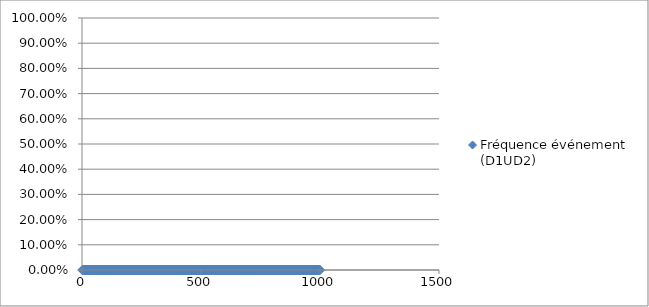
| Category | Fréquence événement (D1UD2) |
|---|---|
| 1.0 | 0 |
| 2.0 | 0 |
| 3.0 | 0 |
| 4.0 | 0 |
| 5.0 | 0 |
| 6.0 | 0 |
| 7.0 | 0 |
| 8.0 | 0 |
| 9.0 | 0 |
| 10.0 | 0 |
| 11.0 | 0 |
| 12.0 | 0 |
| 13.0 | 0 |
| 14.0 | 0 |
| 15.0 | 0 |
| 16.0 | 0 |
| 17.0 | 0 |
| 18.0 | 0 |
| 19.0 | 0 |
| 20.0 | 0 |
| 21.0 | 0 |
| 22.0 | 0 |
| 23.0 | 0 |
| 24.0 | 0 |
| 25.0 | 0 |
| 26.0 | 0 |
| 27.0 | 0 |
| 28.0 | 0 |
| 29.0 | 0 |
| 30.0 | 0 |
| 31.0 | 0 |
| 32.0 | 0 |
| 33.0 | 0 |
| 34.0 | 0 |
| 35.0 | 0 |
| 36.0 | 0 |
| 37.0 | 0 |
| 38.0 | 0 |
| 39.0 | 0 |
| 40.0 | 0 |
| 41.0 | 0 |
| 42.0 | 0 |
| 43.0 | 0 |
| 44.0 | 0 |
| 45.0 | 0 |
| 46.0 | 0 |
| 47.0 | 0 |
| 48.0 | 0 |
| 49.0 | 0 |
| 50.0 | 0 |
| 51.0 | 0 |
| 52.0 | 0 |
| 53.0 | 0 |
| 54.0 | 0 |
| 55.0 | 0 |
| 56.0 | 0 |
| 57.0 | 0 |
| 58.0 | 0 |
| 59.0 | 0 |
| 60.0 | 0 |
| 61.0 | 0 |
| 62.0 | 0 |
| 63.0 | 0 |
| 64.0 | 0 |
| 65.0 | 0 |
| 66.0 | 0 |
| 67.0 | 0 |
| 68.0 | 0 |
| 69.0 | 0 |
| 70.0 | 0 |
| 71.0 | 0 |
| 72.0 | 0 |
| 73.0 | 0 |
| 74.0 | 0 |
| 75.0 | 0 |
| 76.0 | 0 |
| 77.0 | 0 |
| 78.0 | 0 |
| 79.0 | 0 |
| 80.0 | 0 |
| 81.0 | 0 |
| 82.0 | 0 |
| 83.0 | 0 |
| 84.0 | 0 |
| 85.0 | 0 |
| 86.0 | 0 |
| 87.0 | 0 |
| 88.0 | 0 |
| 89.0 | 0 |
| 90.0 | 0 |
| 91.0 | 0 |
| 92.0 | 0 |
| 93.0 | 0 |
| 94.0 | 0 |
| 95.0 | 0 |
| 96.0 | 0 |
| 97.0 | 0 |
| 98.0 | 0 |
| 99.0 | 0 |
| 100.0 | 0 |
| 101.0 | 0 |
| 102.0 | 0 |
| 103.0 | 0 |
| 104.0 | 0 |
| 105.0 | 0 |
| 106.0 | 0 |
| 107.0 | 0 |
| 108.0 | 0 |
| 109.0 | 0 |
| 110.0 | 0 |
| 111.0 | 0 |
| 112.0 | 0 |
| 113.0 | 0 |
| 114.0 | 0 |
| 115.0 | 0 |
| 116.0 | 0 |
| 117.0 | 0 |
| 118.0 | 0 |
| 119.0 | 0 |
| 120.0 | 0 |
| 121.0 | 0 |
| 122.0 | 0 |
| 123.0 | 0 |
| 124.0 | 0 |
| 125.0 | 0 |
| 126.0 | 0 |
| 127.0 | 0 |
| 128.0 | 0 |
| 129.0 | 0 |
| 130.0 | 0 |
| 131.0 | 0 |
| 132.0 | 0 |
| 133.0 | 0 |
| 134.0 | 0 |
| 135.0 | 0 |
| 136.0 | 0 |
| 137.0 | 0 |
| 138.0 | 0 |
| 139.0 | 0 |
| 140.0 | 0 |
| 141.0 | 0 |
| 142.0 | 0 |
| 143.0 | 0 |
| 144.0 | 0 |
| 145.0 | 0 |
| 146.0 | 0 |
| 147.0 | 0 |
| 148.0 | 0 |
| 149.0 | 0 |
| 150.0 | 0 |
| 151.0 | 0 |
| 152.0 | 0 |
| 153.0 | 0 |
| 154.0 | 0 |
| 155.0 | 0 |
| 156.0 | 0 |
| 157.0 | 0 |
| 158.0 | 0 |
| 159.0 | 0 |
| 160.0 | 0 |
| 161.0 | 0 |
| 162.0 | 0 |
| 163.0 | 0 |
| 164.0 | 0 |
| 165.0 | 0 |
| 166.0 | 0 |
| 167.0 | 0 |
| 168.0 | 0 |
| 169.0 | 0 |
| 170.0 | 0 |
| 171.0 | 0 |
| 172.0 | 0 |
| 173.0 | 0 |
| 174.0 | 0 |
| 175.0 | 0 |
| 176.0 | 0 |
| 177.0 | 0 |
| 178.0 | 0 |
| 179.0 | 0 |
| 180.0 | 0 |
| 181.0 | 0 |
| 182.0 | 0 |
| 183.0 | 0 |
| 184.0 | 0 |
| 185.0 | 0 |
| 186.0 | 0 |
| 187.0 | 0 |
| 188.0 | 0 |
| 189.0 | 0 |
| 190.0 | 0 |
| 191.0 | 0 |
| 192.0 | 0 |
| 193.0 | 0 |
| 194.0 | 0 |
| 195.0 | 0 |
| 196.0 | 0 |
| 197.0 | 0 |
| 198.0 | 0 |
| 199.0 | 0 |
| 200.0 | 0 |
| 201.0 | 0 |
| 202.0 | 0 |
| 203.0 | 0 |
| 204.0 | 0 |
| 205.0 | 0 |
| 206.0 | 0 |
| 207.0 | 0 |
| 208.0 | 0 |
| 209.0 | 0 |
| 210.0 | 0 |
| 211.0 | 0 |
| 212.0 | 0 |
| 213.0 | 0 |
| 214.0 | 0 |
| 215.0 | 0 |
| 216.0 | 0 |
| 217.0 | 0 |
| 218.0 | 0 |
| 219.0 | 0 |
| 220.0 | 0 |
| 221.0 | 0 |
| 222.0 | 0 |
| 223.0 | 0 |
| 224.0 | 0 |
| 225.0 | 0 |
| 226.0 | 0 |
| 227.0 | 0 |
| 228.0 | 0 |
| 229.0 | 0 |
| 230.0 | 0 |
| 231.0 | 0 |
| 232.0 | 0 |
| 233.0 | 0 |
| 234.0 | 0 |
| 235.0 | 0 |
| 236.0 | 0 |
| 237.0 | 0 |
| 238.0 | 0 |
| 239.0 | 0 |
| 240.0 | 0 |
| 241.0 | 0 |
| 242.0 | 0 |
| 243.0 | 0 |
| 244.0 | 0 |
| 245.0 | 0 |
| 246.0 | 0 |
| 247.0 | 0 |
| 248.0 | 0 |
| 249.0 | 0 |
| 250.0 | 0 |
| 251.0 | 0 |
| 252.0 | 0 |
| 253.0 | 0 |
| 254.0 | 0 |
| 255.0 | 0 |
| 256.0 | 0 |
| 257.0 | 0 |
| 258.0 | 0 |
| 259.0 | 0 |
| 260.0 | 0 |
| 261.0 | 0 |
| 262.0 | 0 |
| 263.0 | 0 |
| 264.0 | 0 |
| 265.0 | 0 |
| 266.0 | 0 |
| 267.0 | 0 |
| 268.0 | 0 |
| 269.0 | 0 |
| 270.0 | 0 |
| 271.0 | 0 |
| 272.0 | 0 |
| 273.0 | 0 |
| 274.0 | 0 |
| 275.0 | 0 |
| 276.0 | 0 |
| 277.0 | 0 |
| 278.0 | 0 |
| 279.0 | 0 |
| 280.0 | 0 |
| 281.0 | 0 |
| 282.0 | 0 |
| 283.0 | 0 |
| 284.0 | 0 |
| 285.0 | 0 |
| 286.0 | 0 |
| 287.0 | 0 |
| 288.0 | 0 |
| 289.0 | 0 |
| 290.0 | 0 |
| 291.0 | 0 |
| 292.0 | 0 |
| 293.0 | 0 |
| 294.0 | 0 |
| 295.0 | 0 |
| 296.0 | 0 |
| 297.0 | 0 |
| 298.0 | 0 |
| 299.0 | 0 |
| 300.0 | 0 |
| 301.0 | 0 |
| 302.0 | 0 |
| 303.0 | 0 |
| 304.0 | 0 |
| 305.0 | 0 |
| 306.0 | 0 |
| 307.0 | 0 |
| 308.0 | 0 |
| 309.0 | 0 |
| 310.0 | 0 |
| 311.0 | 0 |
| 312.0 | 0 |
| 313.0 | 0 |
| 314.0 | 0 |
| 315.0 | 0 |
| 316.0 | 0 |
| 317.0 | 0 |
| 318.0 | 0 |
| 319.0 | 0 |
| 320.0 | 0 |
| 321.0 | 0 |
| 322.0 | 0 |
| 323.0 | 0 |
| 324.0 | 0 |
| 325.0 | 0 |
| 326.0 | 0 |
| 327.0 | 0 |
| 328.0 | 0 |
| 329.0 | 0 |
| 330.0 | 0 |
| 331.0 | 0 |
| 332.0 | 0 |
| 333.0 | 0 |
| 334.0 | 0 |
| 335.0 | 0 |
| 336.0 | 0 |
| 337.0 | 0 |
| 338.0 | 0 |
| 339.0 | 0 |
| 340.0 | 0 |
| 341.0 | 0 |
| 342.0 | 0 |
| 343.0 | 0 |
| 344.0 | 0 |
| 345.0 | 0 |
| 346.0 | 0 |
| 347.0 | 0 |
| 348.0 | 0 |
| 349.0 | 0 |
| 350.0 | 0 |
| 351.0 | 0 |
| 352.0 | 0 |
| 353.0 | 0 |
| 354.0 | 0 |
| 355.0 | 0 |
| 356.0 | 0 |
| 357.0 | 0 |
| 358.0 | 0 |
| 359.0 | 0 |
| 360.0 | 0 |
| 361.0 | 0 |
| 362.0 | 0 |
| 363.0 | 0 |
| 364.0 | 0 |
| 365.0 | 0 |
| 366.0 | 0 |
| 367.0 | 0 |
| 368.0 | 0 |
| 369.0 | 0 |
| 370.0 | 0 |
| 371.0 | 0 |
| 372.0 | 0 |
| 373.0 | 0 |
| 374.0 | 0 |
| 375.0 | 0 |
| 376.0 | 0 |
| 377.0 | 0 |
| 378.0 | 0 |
| 379.0 | 0 |
| 380.0 | 0 |
| 381.0 | 0 |
| 382.0 | 0 |
| 383.0 | 0 |
| 384.0 | 0 |
| 385.0 | 0 |
| 386.0 | 0 |
| 387.0 | 0 |
| 388.0 | 0 |
| 389.0 | 0 |
| 390.0 | 0 |
| 391.0 | 0 |
| 392.0 | 0 |
| 393.0 | 0 |
| 394.0 | 0 |
| 395.0 | 0 |
| 396.0 | 0 |
| 397.0 | 0 |
| 398.0 | 0 |
| 399.0 | 0 |
| 400.0 | 0 |
| 401.0 | 0 |
| 402.0 | 0 |
| 403.0 | 0 |
| 404.0 | 0 |
| 405.0 | 0 |
| 406.0 | 0 |
| 407.0 | 0 |
| 408.0 | 0 |
| 409.0 | 0 |
| 410.0 | 0 |
| 411.0 | 0 |
| 412.0 | 0 |
| 413.0 | 0 |
| 414.0 | 0 |
| 415.0 | 0 |
| 416.0 | 0 |
| 417.0 | 0 |
| 418.0 | 0 |
| 419.0 | 0 |
| 420.0 | 0 |
| 421.0 | 0 |
| 422.0 | 0 |
| 423.0 | 0 |
| 424.0 | 0 |
| 425.0 | 0 |
| 426.0 | 0 |
| 427.0 | 0 |
| 428.0 | 0 |
| 429.0 | 0 |
| 430.0 | 0 |
| 431.0 | 0 |
| 432.0 | 0 |
| 433.0 | 0 |
| 434.0 | 0 |
| 435.0 | 0 |
| 436.0 | 0 |
| 437.0 | 0 |
| 438.0 | 0 |
| 439.0 | 0 |
| 440.0 | 0 |
| 441.0 | 0 |
| 442.0 | 0 |
| 443.0 | 0 |
| 444.0 | 0 |
| 445.0 | 0 |
| 446.0 | 0 |
| 447.0 | 0 |
| 448.0 | 0 |
| 449.0 | 0 |
| 450.0 | 0 |
| 451.0 | 0 |
| 452.0 | 0 |
| 453.0 | 0 |
| 454.0 | 0 |
| 455.0 | 0 |
| 456.0 | 0 |
| 457.0 | 0 |
| 458.0 | 0 |
| 459.0 | 0 |
| 460.0 | 0 |
| 461.0 | 0 |
| 462.0 | 0 |
| 463.0 | 0 |
| 464.0 | 0 |
| 465.0 | 0 |
| 466.0 | 0 |
| 467.0 | 0 |
| 468.0 | 0 |
| 469.0 | 0 |
| 470.0 | 0 |
| 471.0 | 0 |
| 472.0 | 0 |
| 473.0 | 0 |
| 474.0 | 0 |
| 475.0 | 0 |
| 476.0 | 0 |
| 477.0 | 0 |
| 478.0 | 0 |
| 479.0 | 0 |
| 480.0 | 0 |
| 481.0 | 0 |
| 482.0 | 0 |
| 483.0 | 0 |
| 484.0 | 0 |
| 485.0 | 0 |
| 486.0 | 0 |
| 487.0 | 0 |
| 488.0 | 0 |
| 489.0 | 0 |
| 490.0 | 0 |
| 491.0 | 0 |
| 492.0 | 0 |
| 493.0 | 0 |
| 494.0 | 0 |
| 495.0 | 0 |
| 496.0 | 0 |
| 497.0 | 0 |
| 498.0 | 0 |
| 499.0 | 0 |
| 500.0 | 0 |
| 501.0 | 0 |
| 502.0 | 0 |
| 503.0 | 0 |
| 504.0 | 0 |
| 505.0 | 0 |
| 506.0 | 0 |
| 507.0 | 0 |
| 508.0 | 0 |
| 509.0 | 0 |
| 510.0 | 0 |
| 511.0 | 0 |
| 512.0 | 0 |
| 513.0 | 0 |
| 514.0 | 0 |
| 515.0 | 0 |
| 516.0 | 0 |
| 517.0 | 0 |
| 518.0 | 0 |
| 519.0 | 0 |
| 520.0 | 0 |
| 521.0 | 0 |
| 522.0 | 0 |
| 523.0 | 0 |
| 524.0 | 0 |
| 525.0 | 0 |
| 526.0 | 0 |
| 527.0 | 0 |
| 528.0 | 0 |
| 529.0 | 0 |
| 530.0 | 0 |
| 531.0 | 0 |
| 532.0 | 0 |
| 533.0 | 0 |
| 534.0 | 0 |
| 535.0 | 0 |
| 536.0 | 0 |
| 537.0 | 0 |
| 538.0 | 0 |
| 539.0 | 0 |
| 540.0 | 0 |
| 541.0 | 0 |
| 542.0 | 0 |
| 543.0 | 0 |
| 544.0 | 0 |
| 545.0 | 0 |
| 546.0 | 0 |
| 547.0 | 0 |
| 548.0 | 0 |
| 549.0 | 0 |
| 550.0 | 0 |
| 551.0 | 0 |
| 552.0 | 0 |
| 553.0 | 0 |
| 554.0 | 0 |
| 555.0 | 0 |
| 556.0 | 0 |
| 557.0 | 0 |
| 558.0 | 0 |
| 559.0 | 0 |
| 560.0 | 0 |
| 561.0 | 0 |
| 562.0 | 0 |
| 563.0 | 0 |
| 564.0 | 0 |
| 565.0 | 0 |
| 566.0 | 0 |
| 567.0 | 0 |
| 568.0 | 0 |
| 569.0 | 0 |
| 570.0 | 0 |
| 571.0 | 0 |
| 572.0 | 0 |
| 573.0 | 0 |
| 574.0 | 0 |
| 575.0 | 0 |
| 576.0 | 0 |
| 577.0 | 0 |
| 578.0 | 0 |
| 579.0 | 0 |
| 580.0 | 0 |
| 581.0 | 0 |
| 582.0 | 0 |
| 583.0 | 0 |
| 584.0 | 0 |
| 585.0 | 0 |
| 586.0 | 0 |
| 587.0 | 0 |
| 588.0 | 0 |
| 589.0 | 0 |
| 590.0 | 0 |
| 591.0 | 0 |
| 592.0 | 0 |
| 593.0 | 0 |
| 594.0 | 0 |
| 595.0 | 0 |
| 596.0 | 0 |
| 597.0 | 0 |
| 598.0 | 0 |
| 599.0 | 0 |
| 600.0 | 0 |
| 601.0 | 0 |
| 602.0 | 0 |
| 603.0 | 0 |
| 604.0 | 0 |
| 605.0 | 0 |
| 606.0 | 0 |
| 607.0 | 0 |
| 608.0 | 0 |
| 609.0 | 0 |
| 610.0 | 0 |
| 611.0 | 0 |
| 612.0 | 0 |
| 613.0 | 0 |
| 614.0 | 0 |
| 615.0 | 0 |
| 616.0 | 0 |
| 617.0 | 0 |
| 618.0 | 0 |
| 619.0 | 0 |
| 620.0 | 0 |
| 621.0 | 0 |
| 622.0 | 0 |
| 623.0 | 0 |
| 624.0 | 0 |
| 625.0 | 0 |
| 626.0 | 0 |
| 627.0 | 0 |
| 628.0 | 0 |
| 629.0 | 0 |
| 630.0 | 0 |
| 631.0 | 0 |
| 632.0 | 0 |
| 633.0 | 0 |
| 634.0 | 0 |
| 635.0 | 0 |
| 636.0 | 0 |
| 637.0 | 0 |
| 638.0 | 0 |
| 639.0 | 0 |
| 640.0 | 0 |
| 641.0 | 0 |
| 642.0 | 0 |
| 643.0 | 0 |
| 644.0 | 0 |
| 645.0 | 0 |
| 646.0 | 0 |
| 647.0 | 0 |
| 648.0 | 0 |
| 649.0 | 0 |
| 650.0 | 0 |
| 651.0 | 0 |
| 652.0 | 0 |
| 653.0 | 0 |
| 654.0 | 0 |
| 655.0 | 0 |
| 656.0 | 0 |
| 657.0 | 0 |
| 658.0 | 0 |
| 659.0 | 0 |
| 660.0 | 0 |
| 661.0 | 0 |
| 662.0 | 0 |
| 663.0 | 0 |
| 664.0 | 0 |
| 665.0 | 0 |
| 666.0 | 0 |
| 667.0 | 0 |
| 668.0 | 0 |
| 669.0 | 0 |
| 670.0 | 0 |
| 671.0 | 0 |
| 672.0 | 0 |
| 673.0 | 0 |
| 674.0 | 0 |
| 675.0 | 0 |
| 676.0 | 0 |
| 677.0 | 0 |
| 678.0 | 0 |
| 679.0 | 0 |
| 680.0 | 0 |
| 681.0 | 0 |
| 682.0 | 0 |
| 683.0 | 0 |
| 684.0 | 0 |
| 685.0 | 0 |
| 686.0 | 0 |
| 687.0 | 0 |
| 688.0 | 0 |
| 689.0 | 0 |
| 690.0 | 0 |
| 691.0 | 0 |
| 692.0 | 0 |
| 693.0 | 0 |
| 694.0 | 0 |
| 695.0 | 0 |
| 696.0 | 0 |
| 697.0 | 0 |
| 698.0 | 0 |
| 699.0 | 0 |
| 700.0 | 0 |
| 701.0 | 0 |
| 702.0 | 0 |
| 703.0 | 0 |
| 704.0 | 0 |
| 705.0 | 0 |
| 706.0 | 0 |
| 707.0 | 0 |
| 708.0 | 0 |
| 709.0 | 0 |
| 710.0 | 0 |
| 711.0 | 0 |
| 712.0 | 0 |
| 713.0 | 0 |
| 714.0 | 0 |
| 715.0 | 0 |
| 716.0 | 0 |
| 717.0 | 0 |
| 718.0 | 0 |
| 719.0 | 0 |
| 720.0 | 0 |
| 721.0 | 0 |
| 722.0 | 0 |
| 723.0 | 0 |
| 724.0 | 0 |
| 725.0 | 0 |
| 726.0 | 0 |
| 727.0 | 0 |
| 728.0 | 0 |
| 729.0 | 0 |
| 730.0 | 0 |
| 731.0 | 0 |
| 732.0 | 0 |
| 733.0 | 0 |
| 734.0 | 0 |
| 735.0 | 0 |
| 736.0 | 0 |
| 737.0 | 0 |
| 738.0 | 0 |
| 739.0 | 0 |
| 740.0 | 0 |
| 741.0 | 0 |
| 742.0 | 0 |
| 743.0 | 0 |
| 744.0 | 0 |
| 745.0 | 0 |
| 746.0 | 0 |
| 747.0 | 0 |
| 748.0 | 0 |
| 749.0 | 0 |
| 750.0 | 0 |
| 751.0 | 0 |
| 752.0 | 0 |
| 753.0 | 0 |
| 754.0 | 0 |
| 755.0 | 0 |
| 756.0 | 0 |
| 757.0 | 0 |
| 758.0 | 0 |
| 759.0 | 0 |
| 760.0 | 0 |
| 761.0 | 0 |
| 762.0 | 0 |
| 763.0 | 0 |
| 764.0 | 0 |
| 765.0 | 0 |
| 766.0 | 0 |
| 767.0 | 0 |
| 768.0 | 0 |
| 769.0 | 0 |
| 770.0 | 0 |
| 771.0 | 0 |
| 772.0 | 0 |
| 773.0 | 0 |
| 774.0 | 0 |
| 775.0 | 0 |
| 776.0 | 0 |
| 777.0 | 0 |
| 778.0 | 0 |
| 779.0 | 0 |
| 780.0 | 0 |
| 781.0 | 0 |
| 782.0 | 0 |
| 783.0 | 0 |
| 784.0 | 0 |
| 785.0 | 0 |
| 786.0 | 0 |
| 787.0 | 0 |
| 788.0 | 0 |
| 789.0 | 0 |
| 790.0 | 0 |
| 791.0 | 0 |
| 792.0 | 0 |
| 793.0 | 0 |
| 794.0 | 0 |
| 795.0 | 0 |
| 796.0 | 0 |
| 797.0 | 0 |
| 798.0 | 0 |
| 799.0 | 0 |
| 800.0 | 0 |
| 801.0 | 0 |
| 802.0 | 0 |
| 803.0 | 0 |
| 804.0 | 0 |
| 805.0 | 0 |
| 806.0 | 0 |
| 807.0 | 0 |
| 808.0 | 0 |
| 809.0 | 0 |
| 810.0 | 0 |
| 811.0 | 0 |
| 812.0 | 0 |
| 813.0 | 0 |
| 814.0 | 0 |
| 815.0 | 0 |
| 816.0 | 0 |
| 817.0 | 0 |
| 818.0 | 0 |
| 819.0 | 0 |
| 820.0 | 0 |
| 821.0 | 0 |
| 822.0 | 0 |
| 823.0 | 0 |
| 824.0 | 0 |
| 825.0 | 0 |
| 826.0 | 0 |
| 827.0 | 0 |
| 828.0 | 0 |
| 829.0 | 0 |
| 830.0 | 0 |
| 831.0 | 0 |
| 832.0 | 0 |
| 833.0 | 0 |
| 834.0 | 0 |
| 835.0 | 0 |
| 836.0 | 0 |
| 837.0 | 0 |
| 838.0 | 0 |
| 839.0 | 0 |
| 840.0 | 0 |
| 841.0 | 0 |
| 842.0 | 0 |
| 843.0 | 0 |
| 844.0 | 0 |
| 845.0 | 0 |
| 846.0 | 0 |
| 847.0 | 0 |
| 848.0 | 0 |
| 849.0 | 0 |
| 850.0 | 0 |
| 851.0 | 0 |
| 852.0 | 0 |
| 853.0 | 0 |
| 854.0 | 0 |
| 855.0 | 0 |
| 856.0 | 0 |
| 857.0 | 0 |
| 858.0 | 0 |
| 859.0 | 0 |
| 860.0 | 0 |
| 861.0 | 0 |
| 862.0 | 0 |
| 863.0 | 0 |
| 864.0 | 0 |
| 865.0 | 0 |
| 866.0 | 0 |
| 867.0 | 0 |
| 868.0 | 0 |
| 869.0 | 0 |
| 870.0 | 0 |
| 871.0 | 0 |
| 872.0 | 0 |
| 873.0 | 0 |
| 874.0 | 0 |
| 875.0 | 0 |
| 876.0 | 0 |
| 877.0 | 0 |
| 878.0 | 0 |
| 879.0 | 0 |
| 880.0 | 0 |
| 881.0 | 0 |
| 882.0 | 0 |
| 883.0 | 0 |
| 884.0 | 0 |
| 885.0 | 0 |
| 886.0 | 0 |
| 887.0 | 0 |
| 888.0 | 0 |
| 889.0 | 0 |
| 890.0 | 0 |
| 891.0 | 0 |
| 892.0 | 0 |
| 893.0 | 0 |
| 894.0 | 0 |
| 895.0 | 0 |
| 896.0 | 0 |
| 897.0 | 0 |
| 898.0 | 0 |
| 899.0 | 0 |
| 900.0 | 0 |
| 901.0 | 0 |
| 902.0 | 0 |
| 903.0 | 0 |
| 904.0 | 0 |
| 905.0 | 0 |
| 906.0 | 0 |
| 907.0 | 0 |
| 908.0 | 0 |
| 909.0 | 0 |
| 910.0 | 0 |
| 911.0 | 0 |
| 912.0 | 0 |
| 913.0 | 0 |
| 914.0 | 0 |
| 915.0 | 0 |
| 916.0 | 0 |
| 917.0 | 0 |
| 918.0 | 0 |
| 919.0 | 0 |
| 920.0 | 0 |
| 921.0 | 0 |
| 922.0 | 0 |
| 923.0 | 0 |
| 924.0 | 0 |
| 925.0 | 0 |
| 926.0 | 0 |
| 927.0 | 0 |
| 928.0 | 0 |
| 929.0 | 0 |
| 930.0 | 0 |
| 931.0 | 0 |
| 932.0 | 0 |
| 933.0 | 0 |
| 934.0 | 0 |
| 935.0 | 0 |
| 936.0 | 0 |
| 937.0 | 0 |
| 938.0 | 0 |
| 939.0 | 0 |
| 940.0 | 0 |
| 941.0 | 0 |
| 942.0 | 0 |
| 943.0 | 0 |
| 944.0 | 0 |
| 945.0 | 0 |
| 946.0 | 0 |
| 947.0 | 0 |
| 948.0 | 0 |
| 949.0 | 0 |
| 950.0 | 0 |
| 951.0 | 0 |
| 952.0 | 0 |
| 953.0 | 0 |
| 954.0 | 0 |
| 955.0 | 0 |
| 956.0 | 0 |
| 957.0 | 0 |
| 958.0 | 0 |
| 959.0 | 0 |
| 960.0 | 0 |
| 961.0 | 0 |
| 962.0 | 0 |
| 963.0 | 0 |
| 964.0 | 0 |
| 965.0 | 0 |
| 966.0 | 0 |
| 967.0 | 0 |
| 968.0 | 0 |
| 969.0 | 0 |
| 970.0 | 0 |
| 971.0 | 0 |
| 972.0 | 0 |
| 973.0 | 0 |
| 974.0 | 0 |
| 975.0 | 0 |
| 976.0 | 0 |
| 977.0 | 0 |
| 978.0 | 0 |
| 979.0 | 0 |
| 980.0 | 0 |
| 981.0 | 0 |
| 982.0 | 0 |
| 983.0 | 0 |
| 984.0 | 0 |
| 985.0 | 0 |
| 986.0 | 0 |
| 987.0 | 0 |
| 988.0 | 0 |
| 989.0 | 0 |
| 990.0 | 0 |
| 991.0 | 0 |
| 992.0 | 0 |
| 993.0 | 0 |
| 994.0 | 0 |
| 995.0 | 0 |
| 996.0 | 0 |
| 997.0 | 0 |
| 998.0 | 0 |
| 999.0 | 0 |
| 1000.0 | 0 |